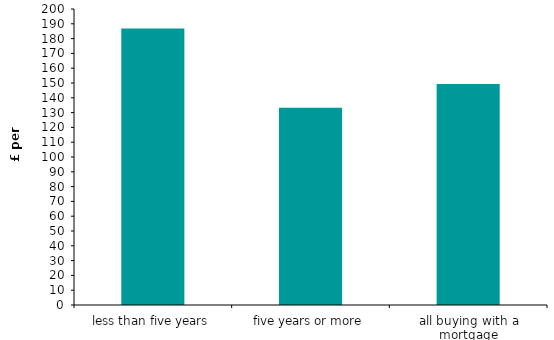
| Category | Series 0 |
|---|---|
| less than five years | 186.874 |
| five years or more | 133.283 |
| all buying with a mortgage | 149.308 |